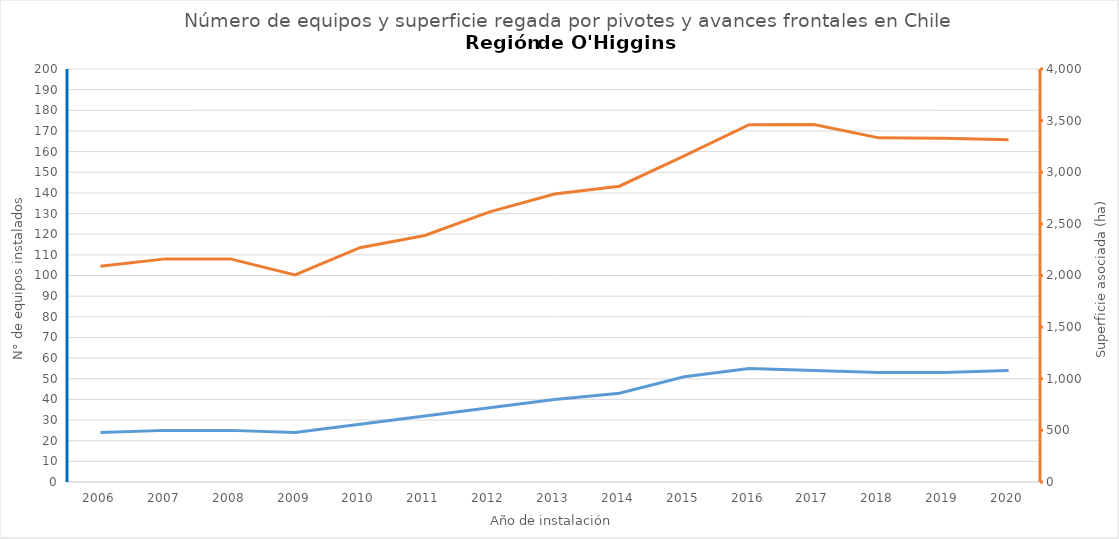
| Category | N° |
|---|---|
| 2006.0 | 24 |
| 2007.0 | 25 |
| 2008.0 | 25 |
| 2009.0 | 24 |
| 2010.0 | 28 |
| 2011.0 | 32 |
| 2012.0 | 36 |
| 2013.0 | 40 |
| 2014.0 | 43 |
| 2015.0 | 51 |
| 2016.0 | 55 |
| 2017.0 | 54 |
| 2018.0 | 53 |
| 2019.0 | 53 |
| 2020.0 | 54 |